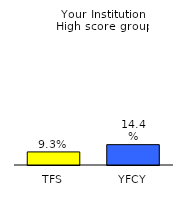
| Category | Series 0 |
|---|---|
| TFS | 0.093 |
| YFCY | 0.144 |